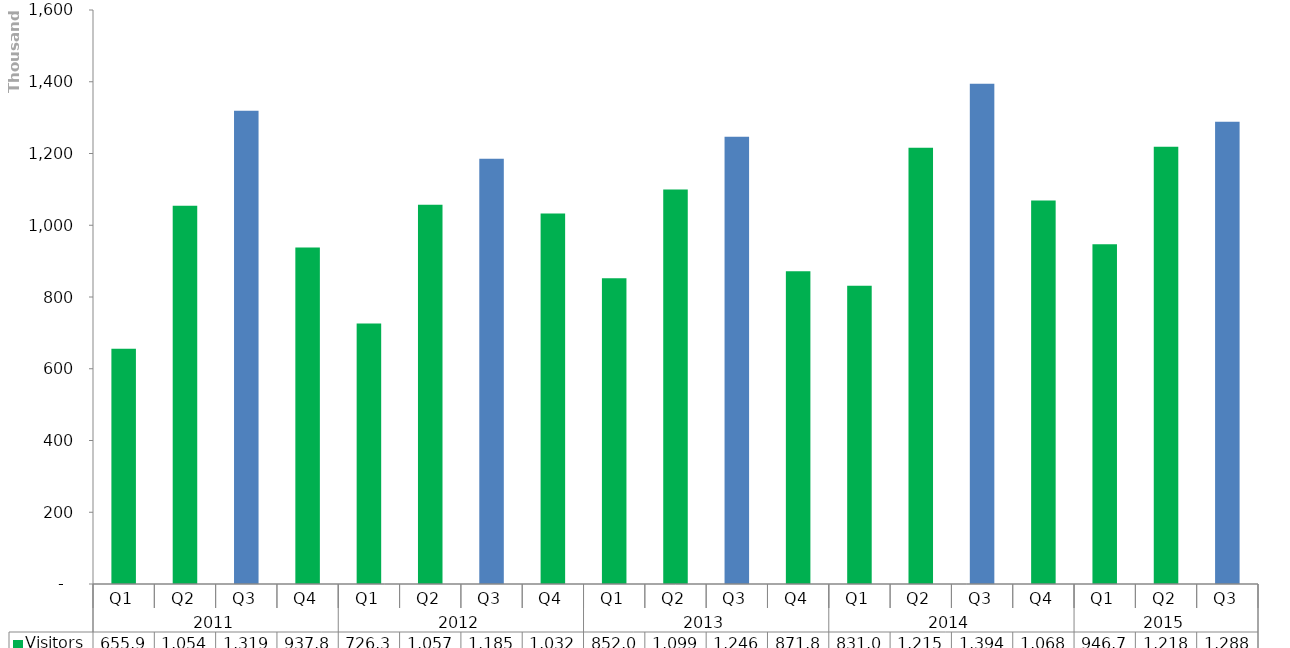
| Category | Visitors  |
|---|---|
| 0 | 655925.434 |
| 1 | 1054505.382 |
| 2 | 1319453.12 |
| 3 | 937878.087 |
| 4 | 726310.693 |
| 5 | 1057004.126 |
| 6 | 1185166.74 |
| 7 | 1032726.182 |
| 8 | 852072.764 |
| 9 | 1099547.111 |
| 10 | 1246373.927 |
| 11 | 871895.419 |
| 12 | 831064.537 |
| 13 | 1215855.377 |
| 14 | 1394356.266 |
| 15 | 1068907.999 |
| 16 | 946762.887 |
| 17 | 1218813.912 |
| 18 | 1288255.032 |